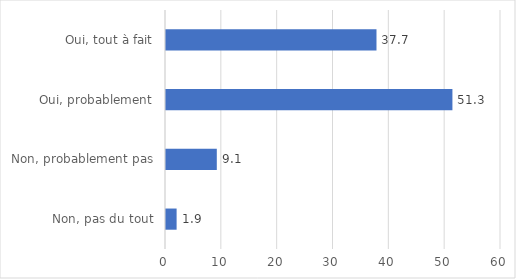
| Category | Series 0 |
|---|---|
| Non, pas du tout | 1.9 |
| Non, probablement pas | 9.1 |
| Oui, probablement | 51.3 |
| Oui, tout à fait | 37.7 |